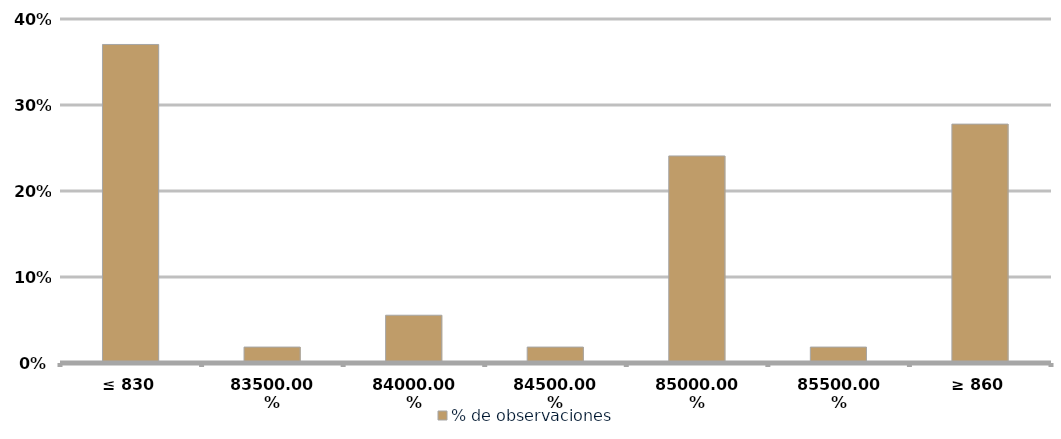
| Category | % de observaciones  |
|---|---|
| ≤ 830 | 0.37 |
| 835 | 0.019 |
| 840 | 0.056 |
| 845 | 0.019 |
| 850 | 0.241 |
| 855 | 0.019 |
| ≥ 860 | 0.278 |